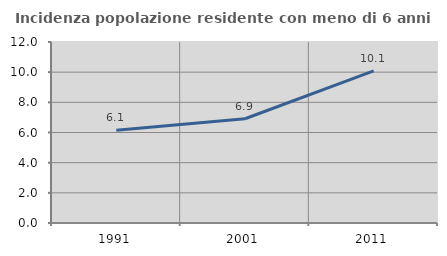
| Category | Incidenza popolazione residente con meno di 6 anni |
|---|---|
| 1991.0 | 6.142 |
| 2001.0 | 6.911 |
| 2011.0 | 10.085 |